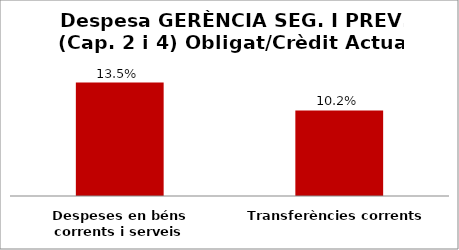
| Category | Series 0 |
|---|---|
| Despeses en béns corrents i serveis | 0.135 |
| Transferències corrents | 0.102 |